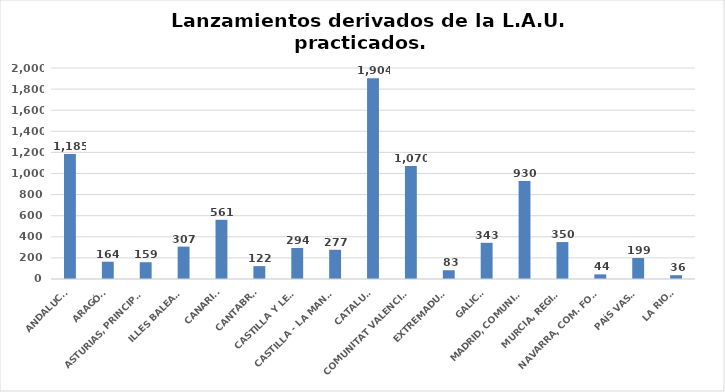
| Category | Series 0 |
|---|---|
| ANDALUCÍA | 1185 |
| ARAGÓN | 164 |
| ASTURIAS, PRINCIPADO | 159 |
| ILLES BALEARS | 307 |
| CANARIAS | 561 |
| CANTABRIA | 122 |
| CASTILLA Y LEÓN | 294 |
| CASTILLA - LA MANCHA | 277 |
| CATALUÑA | 1904 |
| COMUNITAT VALENCIANA | 1070 |
| EXTREMADURA | 83 |
| GALICIA | 343 |
| MADRID, COMUNIDAD | 930 |
| MURCIA, REGIÓN | 350 |
| NAVARRA, COM. FORAL | 44 |
| PAÍS VASCO | 199 |
| LA RIOJA | 36 |